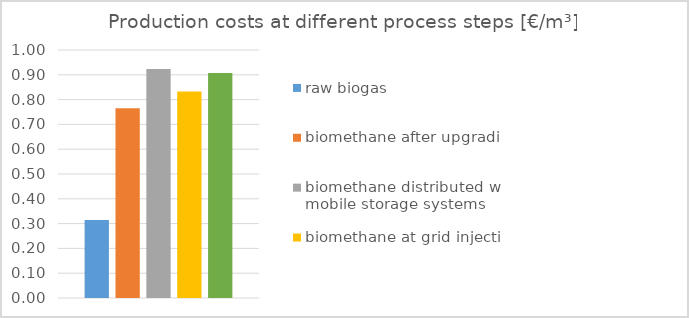
| Category | raw biogas | biomethane after upgrading | biomethane distributed with mobile storage systems | biomethane at grid injection | biomethane at fuel dispenser |
|---|---|---|---|---|---|
| 0 | 0.315 | 0.765 | 0.924 | 0.832 | 0.907 |